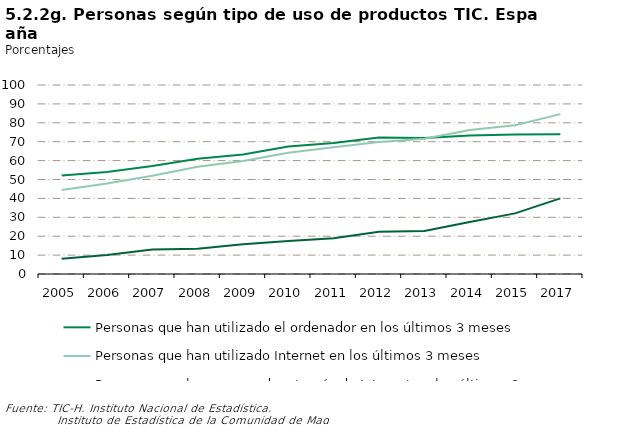
| Category | Personas que han utilizado el ordenador en los últimos 3 meses | Personas que han utilizado Internet en los últimos 3 meses | Personas que han comprado a través de Internet en los últimos 3 meses |
|---|---|---|---|
| 2005.0 | 52.1 | 44.4 | 8.1 |
| 2006.0 | 54 | 47.9 | 10.1 |
| 2007.0 | 57.2 | 52 | 13 |
| 2008.0 | 61 | 56.7 | 13.3 |
| 2009.0 | 63.2 | 59.8 | 15.7 |
| 2010.0 | 67.4 | 64.2 | 17.4 |
| 2011.0 | 69.3 | 67.1 | 18.9 |
| 2012.0 | 72.2 | 69.8 | 22.3 |
| 2013.0 | 72 | 71.6 | 22.7 |
| 2014.0 | 73.323 | 76.187 | 27.531 |
| 2015.0 | 73.802 | 78.69 | 32.066 |
| 2017.0 | 73.992 | 84.602 | 40.016 |